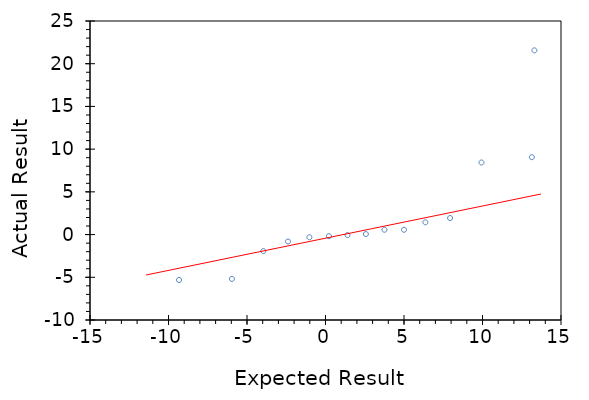
| Category | Series 0 |
|---|---|
| -9.330560786481108 | -5.312 |
| -5.961016892610006 | -5.188 |
| -3.959635359183274 | -1.938 |
| -2.3869712190219623 | -0.812 |
| -1.026767720262139 | -0.313 |
| 0.21797950906300478 | -0.188 |
| 1.4037397526743887 | -0.063 |
| 2.571260247325611 | 0.062 |
| 3.757020490936994 | 0.562 |
| 5.001767720262136 | 0.563 |
| 6.361971219021961 | 1.437 |
| 7.9346353591832735 | 1.938 |
| 9.936016892610006 | 8.438 |
| 13.143509675890357 | 9.062 |
| 13.305560786481106 | 21.563 |